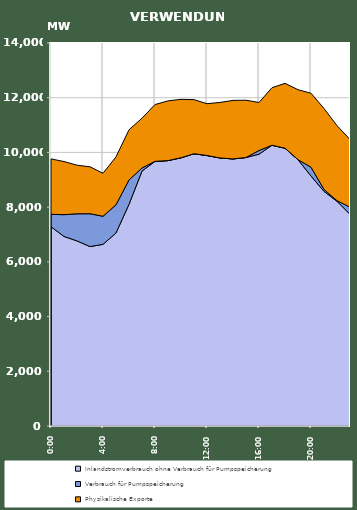
| Category | Inlandstromverbrauch ohne Verbrauch für Pumpspeicherung | Verbrauch für Pumpspeicherung | Physikalische Exporte |
|---|---|---|---|
| 2007-01-17 | 7285.49 | 452.835 | 2025.852 |
| 2007-01-17 01:00:00 | 6928.552 | 796.193 | 1942.101 |
| 2007-01-17 02:00:00 | 6765.905 | 990.559 | 1777.39 |
| 2007-01-17 03:00:00 | 6558.675 | 1200.827 | 1715.073 |
| 2007-01-17 04:00:00 | 6639.634 | 1026.865 | 1570.733 |
| 2007-01-17 05:00:00 | 7055.019 | 1030.475 | 1753.029 |
| 2007-01-17 06:00:00 | 8102.69 | 891.972 | 1833.407 |
| 2007-01-17 07:00:00 | 9319.608 | 111.695 | 1821.282 |
| 2007-01-17 08:00:00 | 9672.052 | 1.332 | 2076.358 |
| 2007-01-17 09:00:00 | 9701.558 | 0.425 | 2182.251 |
| 2007-01-17 10:00:00 | 9803.591 | 1.321 | 2135.53 |
| 2007-01-17 11:00:00 | 9952.084 | 0.342 | 1976.675 |
| 2007-01-17 12:00:00 | 9884.845 | 4.129 | 1892.241 |
| 2007-01-17 13:00:00 | 9797.824 | 0.364 | 2029.097 |
| 2007-01-17 14:00:00 | 9762.172 | 1.335 | 2138.958 |
| 2007-01-17 15:00:00 | 9814.186 | 0.342 | 2093.71 |
| 2007-01-17 16:00:00 | 9935.167 | 135.532 | 1754.693 |
| 2007-01-17 17:00:00 | 10262.177 | 0.363 | 2104.193 |
| 2007-01-17 18:00:00 | 10153.754 | 1.371 | 2369.543 |
| 2007-01-17 19:00:00 | 9734.627 | 0.541 | 2558.3 |
| 2007-01-17 20:00:00 | 9139.122 | 319.561 | 2704.142 |
| 2007-01-17 21:00:00 | 8576.067 | 71.044 | 2959.633 |
| 2007-01-17 22:00:00 | 8213.367 | 22.803 | 2742.806 |
| 2007-01-17 23:00:00 | 7740.479 | 259.105 | 2473.286 |